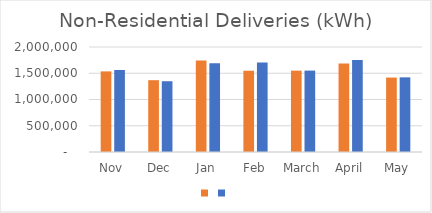
| Category | Series 1 | Series 0 |
|---|---|---|
| Nov | 1535448 | 1561812 |
| Dec | 1367905 | 1348000 |
| Jan | 1741151 | 1691318 |
| Feb | 1548063 | 1705422 |
| March | 1549153 | 1550355 |
| April | 1684677 | 1750598 |
| May | 1417925 | 1421957 |